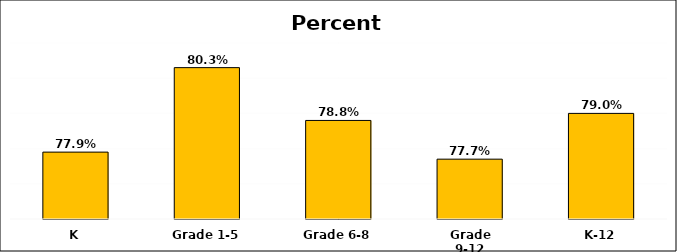
| Category | Series 0 |
|---|---|
| K | 0.779 |
| Grade 1-5 | 0.803 |
| Grade 6-8 | 0.788 |
| Grade 9-12 | 0.777 |
| K-12 | 0.79 |